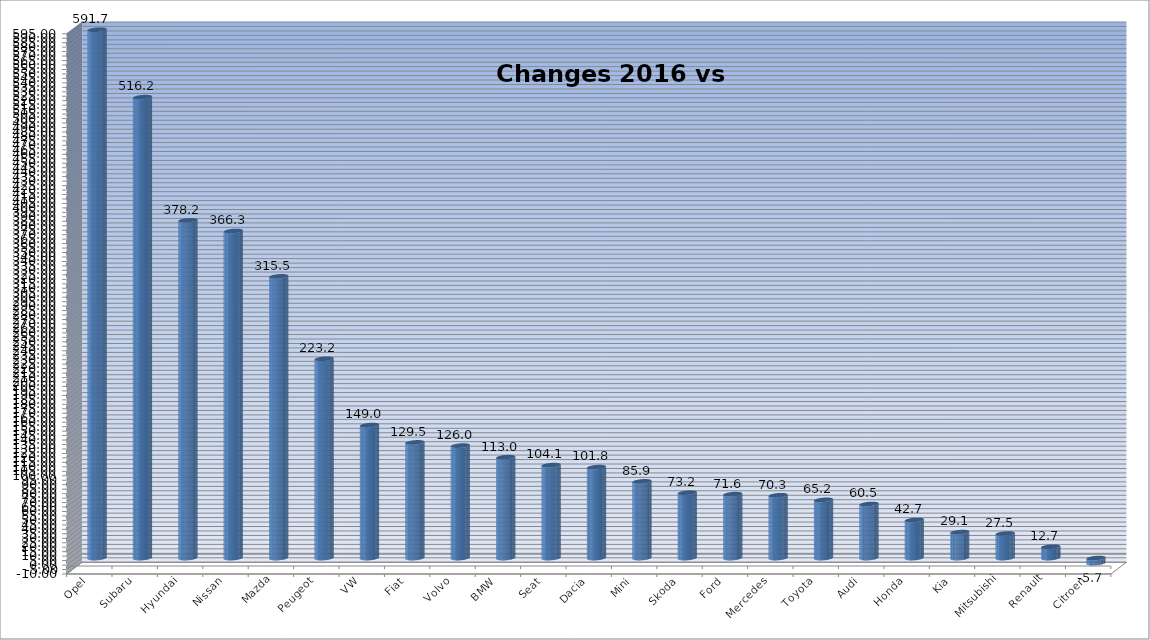
| Category | Ytd 2015 |
|---|---|
| Opel | 591.667 |
| Subaru | 516.176 |
| Hyundai | 378.235 |
| Nissan | 366.3 |
| Mazda | 315.476 |
| Peugeot | 223.175 |
| VW | 148.956 |
| Fiat | 129.515 |
| Volvo | 125.96 |
| BMW | 113.013 |
| Seat | 104.11 |
| Dacia | 101.835 |
| Mini | 85.876 |
| Skoda | 73.208 |
| Ford | 71.572 |
| Mercedes | 70.317 |
| Toyota | 65.204 |
| Audi | 60.55 |
| Honda | 42.661 |
| Kia | 29.07 |
| Mitsubishi | 27.5 |
| Renault | 12.676 |
| Citroen | -5.674 |